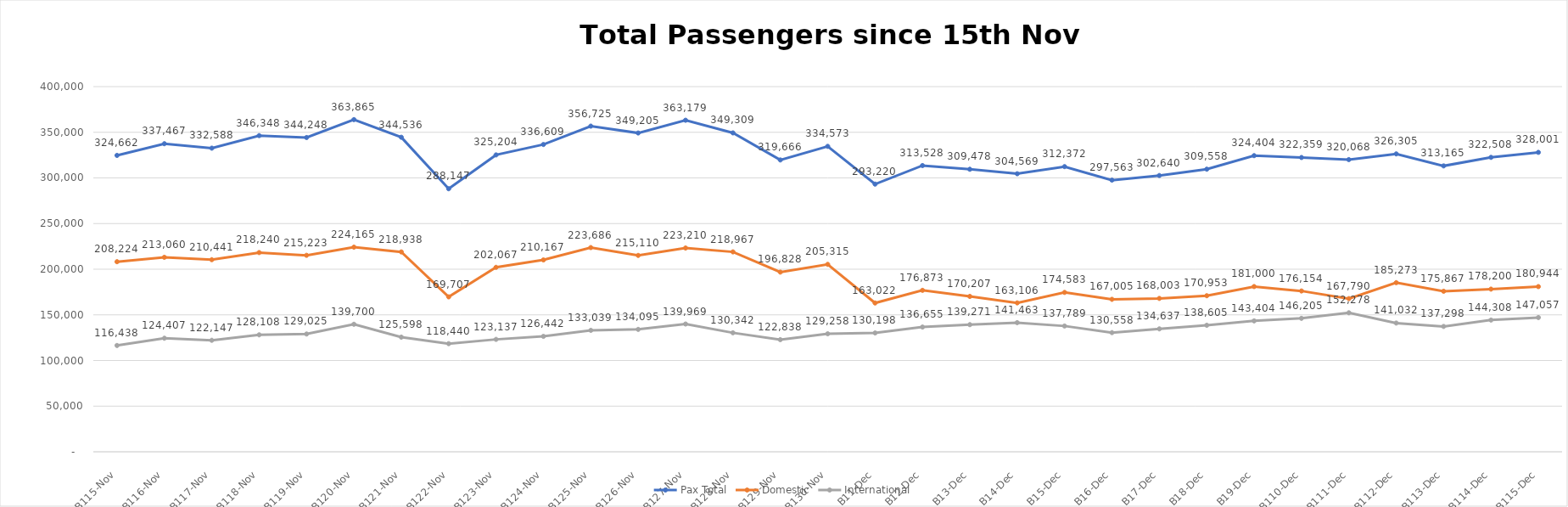
| Category | Pax Total |  Domestic  |  International  |
|---|---|---|---|
| 2022-11-15 | 324662 | 208224 | 116438 |
| 2022-11-16 | 337467 | 213060 | 124407 |
| 2022-11-17 | 332588 | 210441 | 122147 |
| 2022-11-18 | 346348 | 218240 | 128108 |
| 2022-11-19 | 344248 | 215223 | 129025 |
| 2022-11-20 | 363865 | 224165 | 139700 |
| 2022-11-21 | 344536 | 218938 | 125598 |
| 2022-11-22 | 288147 | 169707 | 118440 |
| 2022-11-23 | 325204 | 202067 | 123137 |
| 2022-11-24 | 336609 | 210167 | 126442 |
| 2022-11-25 | 356725 | 223686 | 133039 |
| 2022-11-26 | 349205 | 215110 | 134095 |
| 2022-11-27 | 363179 | 223210 | 139969 |
| 2022-11-28 | 349309 | 218967 | 130342 |
| 2022-11-29 | 319666 | 196828 | 122838 |
| 2022-11-30 | 334573 | 205315 | 129258 |
| 2022-12-01 | 293220 | 163022 | 130198 |
| 2022-12-02 | 313528 | 176873 | 136655 |
| 2022-12-03 | 309478 | 170207 | 139271 |
| 2022-12-04 | 304569 | 163106 | 141463 |
| 2022-12-05 | 312372 | 174583 | 137789 |
| 2022-12-06 | 297563 | 167005 | 130558 |
| 2022-12-07 | 302640 | 168003 | 134637 |
| 2022-12-08 | 309558 | 170953 | 138605 |
| 2022-12-09 | 324404 | 181000 | 143404 |
| 2022-12-10 | 322359 | 176154 | 146205 |
| 2022-12-11 | 320068 | 167790 | 152278 |
| 2022-12-12 | 326305 | 185273 | 141032 |
| 2022-12-13 | 313165 | 175867 | 137298 |
| 2022-12-14 | 322508 | 178200 | 144308 |
| 2022-12-15 | 328001 | 180944 | 147057 |